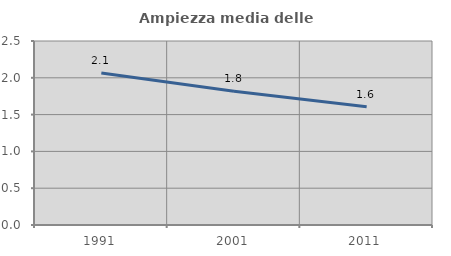
| Category | Ampiezza media delle famiglie |
|---|---|
| 1991.0 | 2.066 |
| 2001.0 | 1.816 |
| 2011.0 | 1.607 |